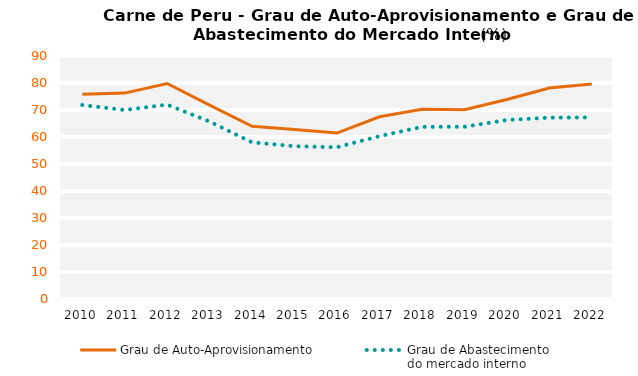
| Category | Grau de Auto-Aprovisionamento | Grau de Abastecimento
do mercado interno |
|---|---|---|
| 2010.0 | 75.801 | 71.849 |
| 2011.0 | 76.252 | 69.977 |
| 2012.0 | 79.807 | 71.975 |
| 2013.0 | 71.807 | 65.709 |
| 2014.0 | 63.942 | 58.017 |
| 2015.0 | 62.736 | 56.595 |
| 2016.0 | 61.445 | 56.199 |
| 2017.0 | 67.473 | 60.315 |
| 2018.0 | 70.264 | 63.749 |
| 2019.0 | 70.072 | 63.799 |
| 2020.0 | 73.867 | 66.288 |
| 2021.0 | 78.143 | 67.167 |
| 2022.0 | 79.651 | 67.263 |